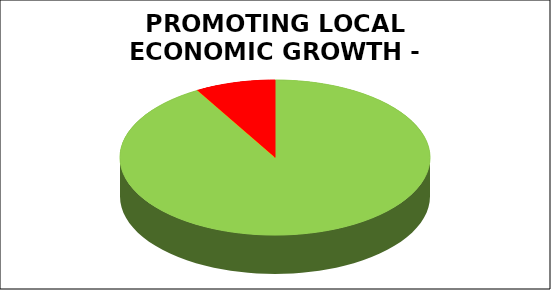
| Category | Series 0 |
|---|---|
| Green | 0.917 |
| Amber | 0 |
| Red | 0.083 |